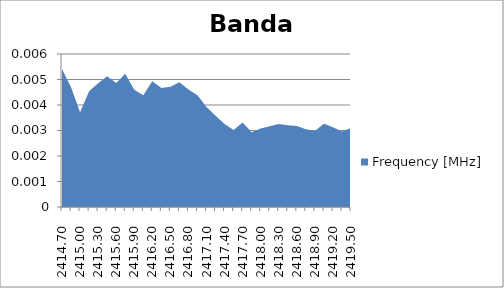
| Category | Frequency [MHz] |
|---|---|
| 2414.7 | 0.005 |
| 2414.85 | 0.005 |
| 2415.0 | 0.004 |
| 2415.15 | 0.005 |
| 2415.3 | 0.005 |
| 2415.45 | 0.005 |
| 2415.6 | 0.005 |
| 2415.75 | 0.005 |
| 2415.9 | 0.005 |
| 2416.05 | 0.004 |
| 2416.2 | 0.005 |
| 2416.35 | 0.005 |
| 2416.5 | 0.005 |
| 2416.65 | 0.005 |
| 2416.8 | 0.005 |
| 2416.95 | 0.004 |
| 2417.1 | 0.004 |
| 2417.25 | 0.004 |
| 2417.4 | 0.003 |
| 2417.55 | 0.003 |
| 2417.7 | 0.003 |
| 2417.85 | 0.003 |
| 2418.0 | 0.003 |
| 2418.15 | 0.003 |
| 2418.3 | 0.003 |
| 2418.45 | 0.003 |
| 2418.6 | 0.003 |
| 2418.75 | 0.003 |
| 2418.9 | 0.003 |
| 2419.05 | 0.003 |
| 2419.2 | 0.003 |
| 2419.35 | 0.003 |
| 2419.5 | 0.003 |